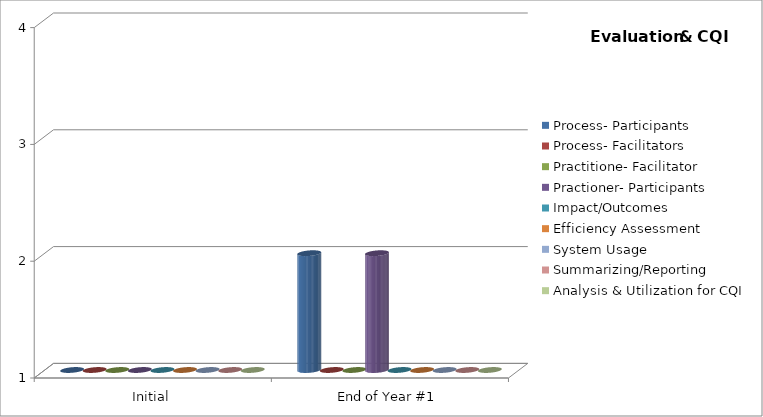
| Category | Process- Participants  | Process- Facilitators | Practitione- Facilitator  | Practioner- Participants | Impact/Outcomes  | Efficiency Assessment  | System Usage  | Summarizing/Reporting | Analysis & Utilization for CQI |
|---|---|---|---|---|---|---|---|---|---|
| Initial | 1 | 1 | 1 | 1 | 1 | 1 | 1 | 1 | 1 |
| End of Year #1 | 2 | 1 | 1 | 2 | 1 | 1 | 1 | 1 | 1 |